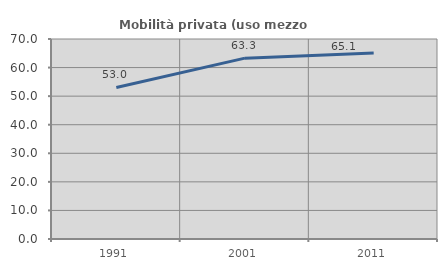
| Category | Mobilità privata (uso mezzo privato) |
|---|---|
| 1991.0 | 53.027 |
| 2001.0 | 63.303 |
| 2011.0 | 65.079 |